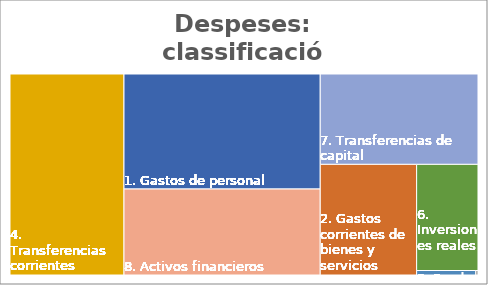
| Category | Series 0 |
|---|---|
| 1. Gastos de personal | 0.24 |
| 2. Gastos corrientes de bienes y servicios | 0.113 |
| 3. Gastos financieros | 0 |
| 4. Transferencias corrientes | 0.244 |
| 5. Fondo de contigencia y otros imprevistos | 0.003 |
| 6. Inversiones reales | 0.069 |
| 7. Transferencias de capital | 0.152 |
| 8. Activos financieros | 0.179 |